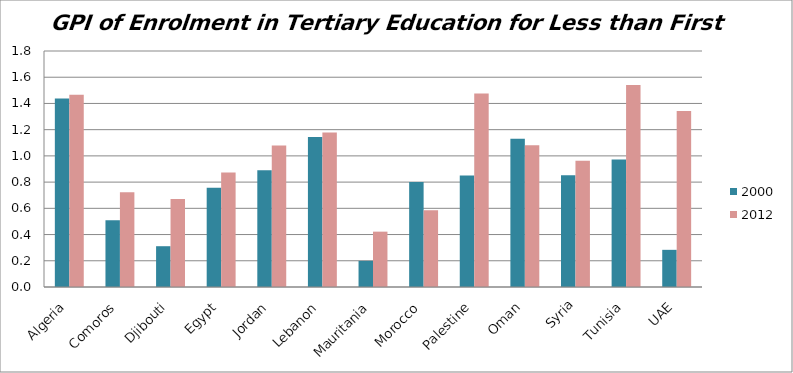
| Category | 2000 | 2012 |
|---|---|---|
| Algeria | 1.438 | 1.467 |
| Comoros | 0.51 | 0.723 |
| Djibouti | 0.311 | 0.67 |
| Egypt | 0.757 | 0.873 |
| Jordan | 0.891 | 1.079 |
| Lebanon | 1.144 | 1.179 |
| Mauritania | 0.199 | 0.422 |
| Morocco | 0.8 | 0.586 |
| Palestine | 0.85 | 1.475 |
| Oman | 1.131 | 1.082 |
| Syria | 0.852 | 0.962 |
| Tunisia | 0.972 | 1.541 |
| UAE | 0.283 | 1.342 |